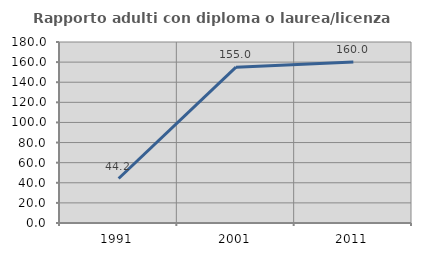
| Category | Rapporto adulti con diploma o laurea/licenza media  |
|---|---|
| 1991.0 | 44.231 |
| 2001.0 | 155 |
| 2011.0 | 160 |